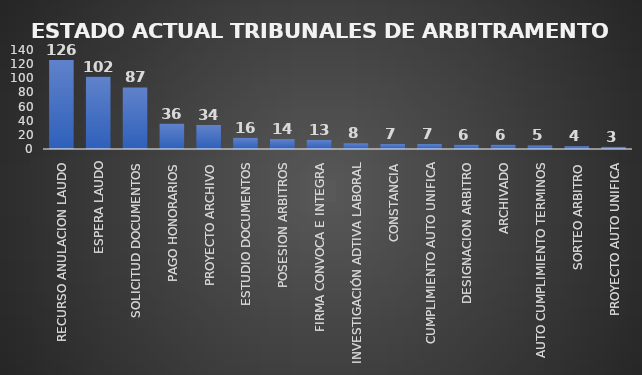
| Category | CANTIDAD | % |
|---|---|---|
| RECURSO ANULACION LAUDO | 126 | 0.262 |
| ESPERA LAUDO | 102 | 0.193 |
| SOLICITUD DOCUMENTOS | 87 | 0.172 |
| PAGO HONORARIOS | 36 | 0.067 |
| PROYECTO ARCHIVO | 34 | 0.08 |
| ESTUDIO DOCUMENTOS | 16 | 0.036 |
| POSESION ARBITROS | 14 | 0.029 |
| FIRMA CONVOCA E INTEGRA | 13 | 0.027 |
| INVESTIGACIÓN ADTIVA LABORAL | 8 | 0.014 |
| CONSTANCIA | 7 | 0.019 |
| CUMPLIMIENTO AUTO UNIFICA | 7 | 0.014 |
| DESIGNACION ARBITRO | 6 | 0.015 |
| ARCHIVADO | 6 | 0.01 |
| AUTO CUMPLIMIENTO TERMINOS | 5 | 0.011 |
| SORTEO ARBITRO | 4 | 0.008 |
| PROYECTO AUTO UNIFICA | 3 | 0.007 |